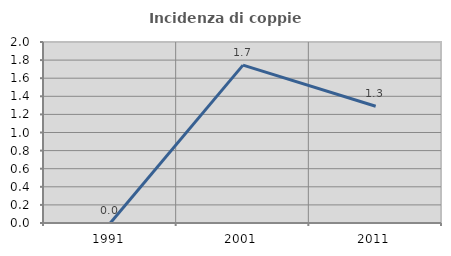
| Category | Incidenza di coppie miste |
|---|---|
| 1991.0 | 0 |
| 2001.0 | 1.744 |
| 2011.0 | 1.29 |